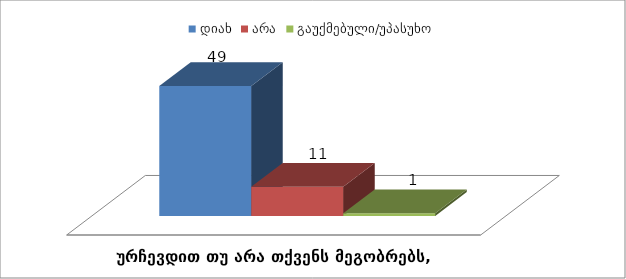
| Category | დიახ | არა | გაუქმებული/უპასუხო |
|---|---|---|---|
| ურჩევდით თუ არა თქვენს მეგობრებს, ნათესავებს ჩვენ კოლეჯში სწავლა? | 49 | 11 | 1 |